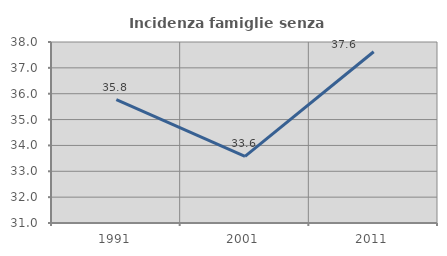
| Category | Incidenza famiglie senza nuclei |
|---|---|
| 1991.0 | 35.77 |
| 2001.0 | 33.577 |
| 2011.0 | 37.624 |